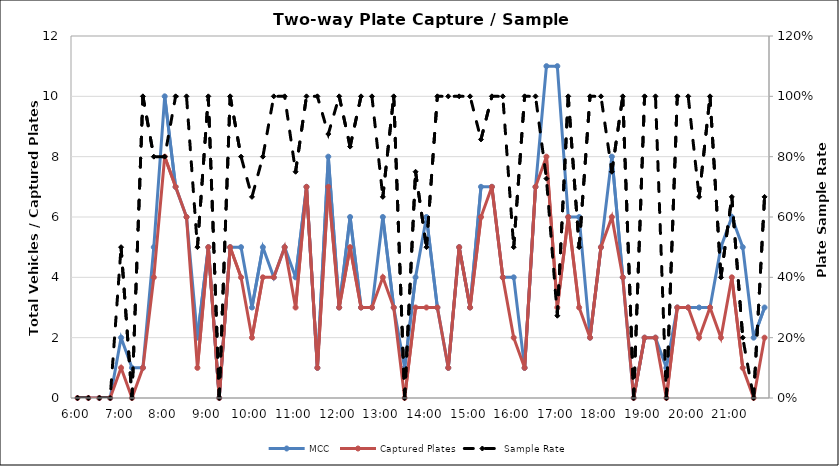
| Category | MCC | Captured Plates |
|---|---|---|
| 0.25 | 0 | 0 |
| 0.260416666666667 | 0 | 0 |
| 0.270833333333333 | 0 | 0 |
| 0.28125 | 0 | 0 |
| 0.291666666666667 | 2 | 1 |
| 0.302083333333333 | 1 | 0 |
| 0.3125 | 1 | 1 |
| 0.322916666666667 | 5 | 4 |
| 0.333333333333333 | 10 | 8 |
| 0.34375 | 7 | 7 |
| 0.354166666666667 | 6 | 6 |
| 0.364583333333333 | 2 | 1 |
| 0.375 | 5 | 5 |
| 0.385416666666667 | 0 | 0 |
| 0.395833333333333 | 5 | 5 |
| 0.40625 | 5 | 4 |
| 0.416666666666667 | 3 | 2 |
| 0.427083333333333 | 5 | 4 |
| 0.4375 | 4 | 4 |
| 0.447916666666667 | 5 | 5 |
| 0.458333333333333 | 4 | 3 |
| 0.46875 | 7 | 7 |
| 0.479166666666667 | 1 | 1 |
| 0.489583333333333 | 8 | 7 |
| 0.5 | 3 | 3 |
| 0.510416666666667 | 6 | 5 |
| 0.520833333333333 | 3 | 3 |
| 0.53125 | 3 | 3 |
| 0.541666666666667 | 6 | 4 |
| 0.552083333333333 | 3 | 3 |
| 0.5625 | 1 | 0 |
| 0.572916666666667 | 4 | 3 |
| 0.583333333333333 | 6 | 3 |
| 0.59375 | 3 | 3 |
| 0.604166666666667 | 1 | 1 |
| 0.614583333333333 | 5 | 5 |
| 0.625 | 3 | 3 |
| 0.635416666666667 | 7 | 6 |
| 0.645833333333333 | 7 | 7 |
| 0.65625 | 4 | 4 |
| 0.666666666666667 | 4 | 2 |
| 0.677083333333333 | 1 | 1 |
| 0.6875 | 7 | 7 |
| 0.697916666666667 | 11 | 8 |
| 0.708333333333333 | 11 | 3 |
| 0.71875 | 6 | 6 |
| 0.729166666666667 | 6 | 3 |
| 0.739583333333333 | 2 | 2 |
| 0.75 | 5 | 5 |
| 0.760416666666667 | 8 | 6 |
| 0.770833333333333 | 4 | 4 |
| 0.78125 | 0 | 0 |
| 0.791666666666667 | 2 | 2 |
| 0.802083333333333 | 2 | 2 |
| 0.8125 | 1 | 0 |
| 0.822916666666667 | 3 | 3 |
| 0.833333333333333 | 3 | 3 |
| 0.84375 | 3 | 2 |
| 0.854166666666667 | 3 | 3 |
| 0.864583333333333 | 5 | 2 |
| 0.875 | 6 | 4 |
| 0.885416666666667 | 5 | 1 |
| 0.895833333333333 | 2 | 0 |
| 0.90625 | 3 | 2 |